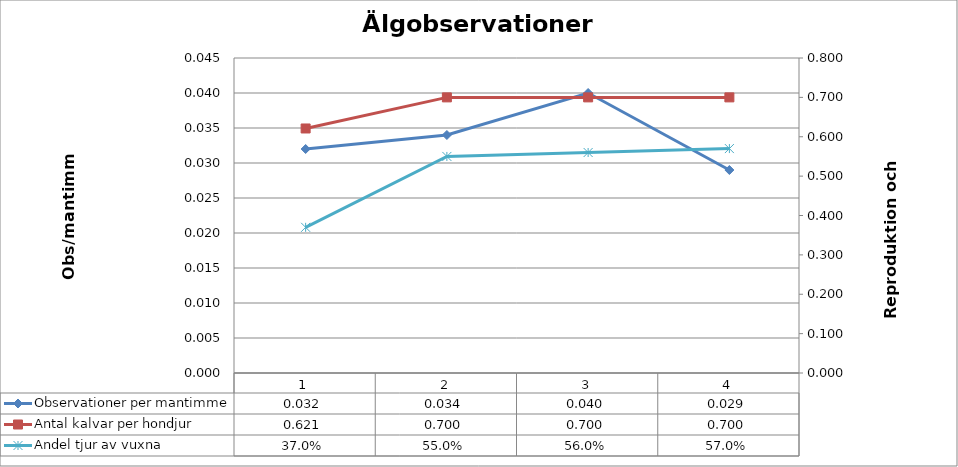
| Category | Observationer per mantimme |
|---|---|
| 0 | 0.032 |
| 1 | 0.034 |
| 2 | 0.04 |
| 3 | 0.029 |